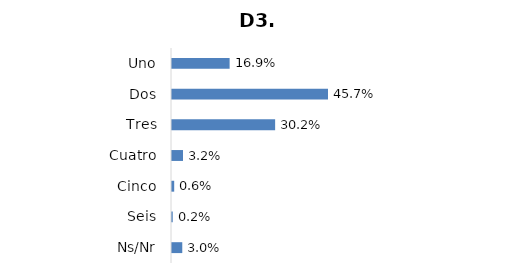
| Category | Series 0 |
|---|---|
| Uno | 0.169 |
| Dos | 0.457 |
| Tres | 0.302 |
| Cuatro | 0.032 |
| Cinco | 0.006 |
| Seis | 0.002 |
| Ns/Nr | 0.03 |